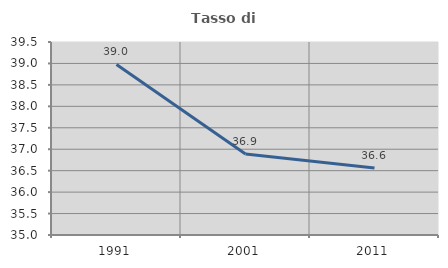
| Category | Tasso di occupazione   |
|---|---|
| 1991.0 | 38.976 |
| 2001.0 | 36.89 |
| 2011.0 | 36.562 |